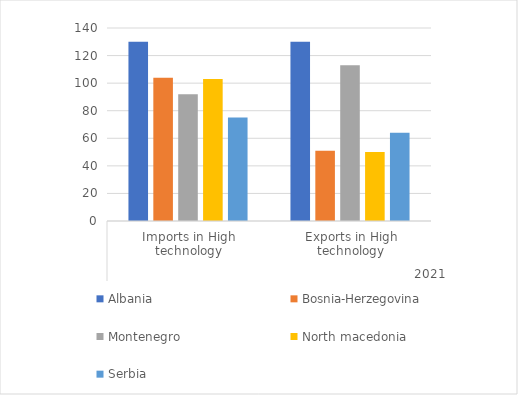
| Category | Albania | Bosnia-Herzegovina | Montenegro | North macedonia | Serbia |
|---|---|---|---|---|---|
| 0 | 130 | 104 | 92 | 103 | 75 |
| 1 | 130 | 51 | 113 | 50 | 64 |